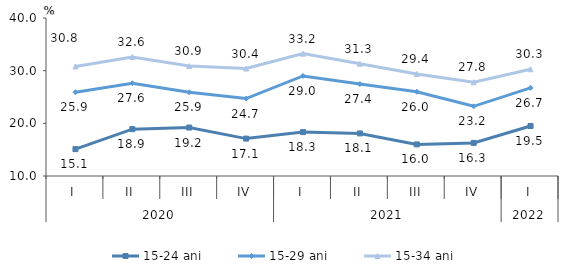
| Category | 15-24 ani | 15-29 ani | 15-34 ani |
|---|---|---|---|
| 0 | 15.1 | 25.9 | 30.8 |
| 1 | 18.9 | 27.6 | 32.6 |
| 2 | 19.2 | 25.9 | 30.9 |
| 3 | 17.1 | 24.7 | 30.4 |
| 4 | 18.335 | 28.999 | 33.235 |
| 5 | 18.083 | 27.448 | 31.318 |
| 6 | 16 | 26 | 29.373 |
| 7 | 16.283 | 23.232 | 27.8 |
| 8 | 19.497 | 26.744 | 30.262 |